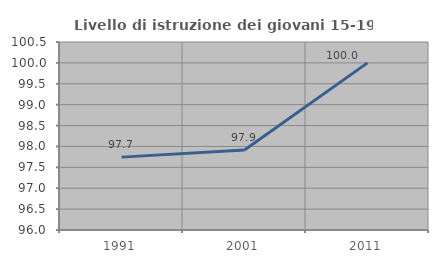
| Category | Livello di istruzione dei giovani 15-19 anni |
|---|---|
| 1991.0 | 97.744 |
| 2001.0 | 97.917 |
| 2011.0 | 100 |